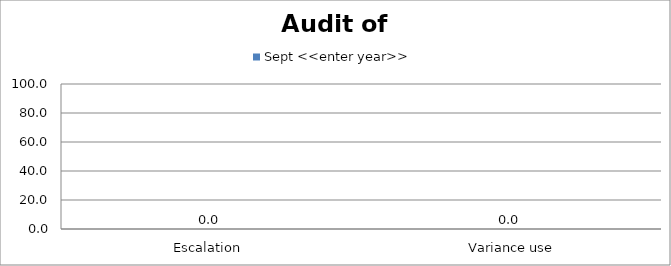
| Category | Sept <<enter year>> |
|---|---|
| Escalation  | 0 |
|  Variance use | 0 |